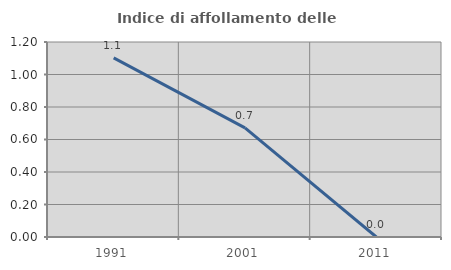
| Category | Indice di affollamento delle abitazioni  |
|---|---|
| 1991.0 | 1.102 |
| 2001.0 | 0.671 |
| 2011.0 | 0 |